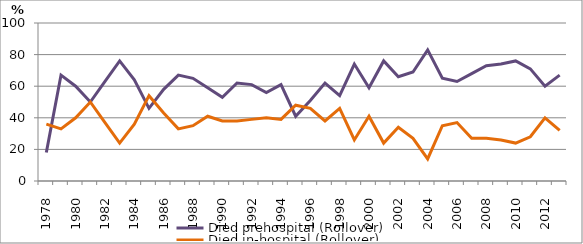
| Category | Died prehospital (Rollover) | Died in-hospital (Rollover) |
|---|---|---|
| 1978.0 | 18 | 36 |
| 1979.0 | 67 | 33 |
| 1980.0 | 60 | 40 |
| 1981.0 | 50 | 50 |
| 1982.0 | 63 | 37 |
| 1983.0 | 76 | 24 |
| 1984.0 | 64 | 36 |
| 1985.0 | 46 | 54 |
| 1986.0 | 58 | 43 |
| 1987.0 | 67 | 33 |
| 1988.0 | 65 | 35 |
| 1989.0 | 59 | 41 |
| 1990.0 | 53 | 38 |
| 1991.0 | 62 | 38 |
| 1992.0 | 61 | 39 |
| 1993.0 | 56 | 40 |
| 1994.0 | 61 | 39 |
| 1995.0 | 41 | 48 |
| 1996.0 | 51 | 46 |
| 1997.0 | 62 | 38 |
| 1998.0 | 54 | 46 |
| 1999.0 | 74 | 26 |
| 2000.0 | 59 | 41 |
| 2001.0 | 76 | 24 |
| 2002.0 | 66 | 34 |
| 2003.0 | 69 | 27 |
| 2004.0 | 83 | 14 |
| 2005.0 | 65 | 35 |
| 2006.0 | 63 | 37 |
| 2007.0 | 68 | 27 |
| 2008.0 | 73 | 27 |
| 2009.0 | 74 | 26 |
| 2010.0 | 76 | 24 |
| 2011.0 | 71 | 28 |
| 2012.0 | 60 | 40 |
| 2013.0 | 67 | 32 |